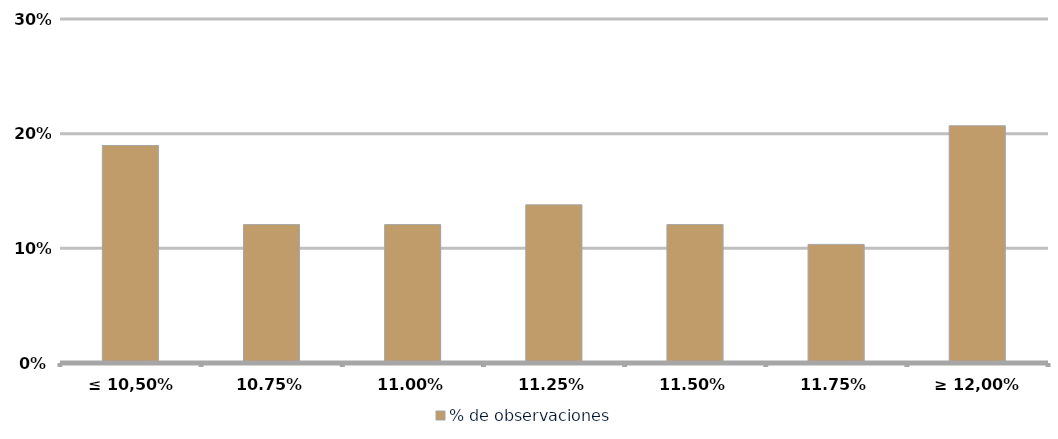
| Category | % de observaciones  |
|---|---|
| ≤ 10,50% | 0.19 |
| 10,75% | 0.121 |
| 11,00% | 0.121 |
| 11,25% | 0.138 |
| 11,50% | 0.121 |
| 11,75% | 0.103 |
| ≥ 12,00% | 0.207 |